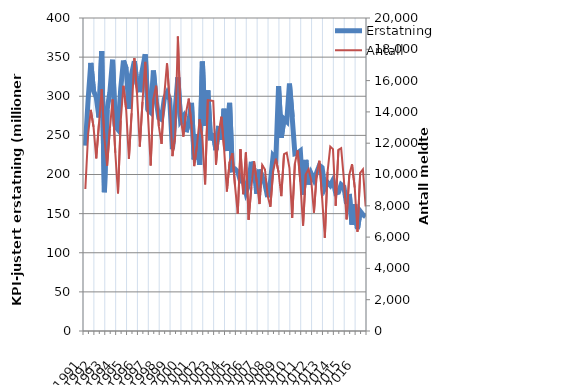
| Category | Erstatning |
|---|---|
| 1991.0 | 236.93 |
| nan | 294.783 |
| nan | 342.604 |
| nan | 306.85 |
| 1992.0 | 298.702 |
| nan | 272.93 |
| nan | 357.674 |
| nan | 177.392 |
| 1993.0 | 282.989 |
| nan | 304.909 |
| nan | 346.657 |
| nan | 261.754 |
| 1994.0 | 257.298 |
| nan | 309.812 |
| nan | 345.57 |
| nan | 335.26 |
| 1995.0 | 283.864 |
| nan | 328.377 |
| nan | 344.843 |
| nan | 315.774 |
| 1996.0 | 305.279 |
| nan | 335.126 |
| nan | 353.585 |
| nan | 282.683 |
| 1997.0 | 279.48 |
| nan | 332.877 |
| nan | 294.639 |
| nan | 272.383 |
| 1998.0 | 270.352 |
| nan | 296.571 |
| nan | 304.109 |
| nan | 295.927 |
| 1999.0 | 232.48 |
| nan | 282.091 |
| nan | 324.198 |
| nan | 268.894 |
| 2000.0 | 274.096 |
| nan | 254.192 |
| nan | 266.636 |
| nan | 291.498 |
| 2001.0 | 219.204 |
| nan | 251.418 |
| nan | 212.311 |
| nan | 344.35 |
| 2002.0 | 262.177 |
| nan | 307.371 |
| nan | 243.755 |
| nan | 253.074 |
| 2003.0 | 231.225 |
| nan | 262.007 |
| nan | 244.31 |
| nan | 284.07 |
| 2004.0 | 230.06 |
| nan | 291.643 |
| nan | 206.052 |
| nan | 206.912 |
| 2005.0 | 203.382 |
| nan | 191.684 |
| nan | 192.48 |
| nan | 177.255 |
| 2006.0 | 187.023 |
| nan | 216.279 |
| nan | 206.275 |
| nan | 175.342 |
| 2007.0 | 206.294 |
| nan | 197.065 |
| nan | 187.945 |
| nan | 171.171 |
| 2008.0 | 190.176 |
| nan | 223.609 |
| nan | 219.141 |
| nan | 313.056 |
| 2009.0 | 246.971 |
| nan | 271.054 |
| nan | 267.661 |
| nan | 316.135 |
| 2010.0 | 273.511 |
| nan | 226.468 |
| nan | 227.397 |
| nan | 230.109 |
| 2011.0 | 174.049 |
| nan | 218.637 |
| nan | 187.211 |
| nan | 200.949 |
| 2012.0 | 193.218 |
| nan | 202.53 |
| nan | 211.663 |
| nan | 208.882 |
| 2013.0 | 182.74 |
| nan | 189.941 |
| nan | 186.037 |
| nan | 192.746 |
| 2014.0 | 176.109 |
| nan | 177.235 |
| nan | 187.111 |
| nan | 184.198 |
| 2015.0 | 162.554 |
| nan | 175.142 |
| nan | 135.952 |
| nan | 162.027 |
| 2016.0 | 130.485 |
| nan | 153.144 |
| nan | 148.639 |
| nan | 145.95 |